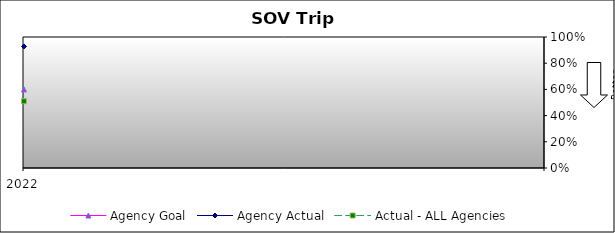
| Category | Agency Goal | Agency Actual | Actual - ALL Agencies |
|---|---|---|---|
| 2022.0 | 0.6 | 0.928 | 0.509 |